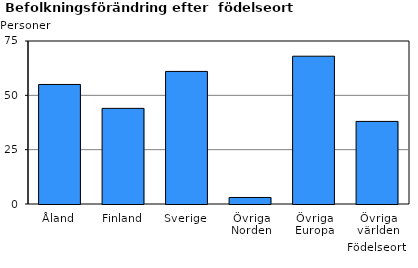
| Category | Series 0 |
|---|---|
| Åland | 55 |
| Finland | 44 |
| Sverige | 61 |
| Övriga Norden | 3 |
| Övriga Europa | 68 |
| Övriga världen | 38 |